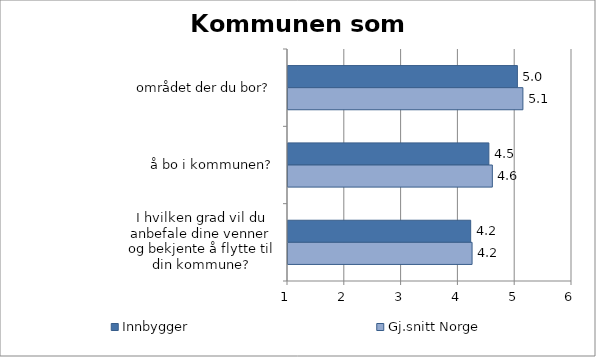
| Category | Innbygger | Gj.snitt Norge |
|---|---|---|
| området der du bor? | 5.039 | 5.136 |
| å bo i kommunen? | 4.537 | 4.598 |
| I hvilken grad vil du anbefale dine venner og bekjente å flytte til din kommune? | 4.216 | 4.241 |